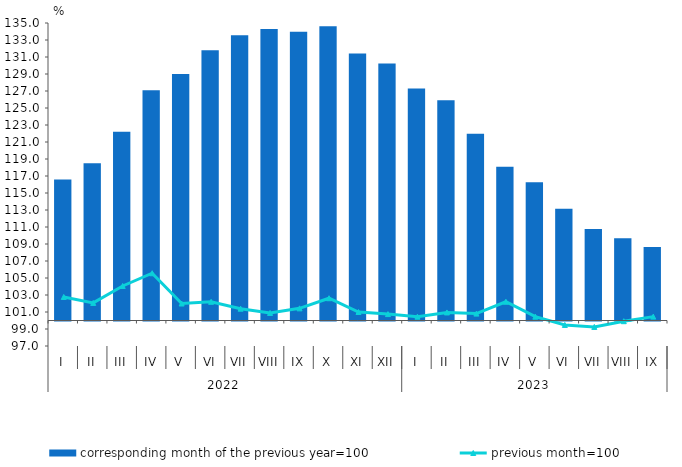
| Category | corresponding month of the previous year=100 |
|---|---|
| 0 | 116.6 |
| 1 | 118.5 |
| 2 | 122.2 |
| 3 | 127.1 |
| 4 | 129 |
| 5 | 131.8 |
| 6 | 133.55 |
| 7 | 134.29 |
| 8 | 133.97 |
| 9 | 134.62 |
| 10 | 131.4 |
| 11 | 130.24 |
| 12 | 127.307 |
| 13 | 125.905 |
| 14 | 121.977 |
| 15 | 118.102 |
| 16 | 116.262 |
| 17 | 113.152 |
| 18 | 110.755 |
| 19 | 109.689 |
| 20 | 108.634 |